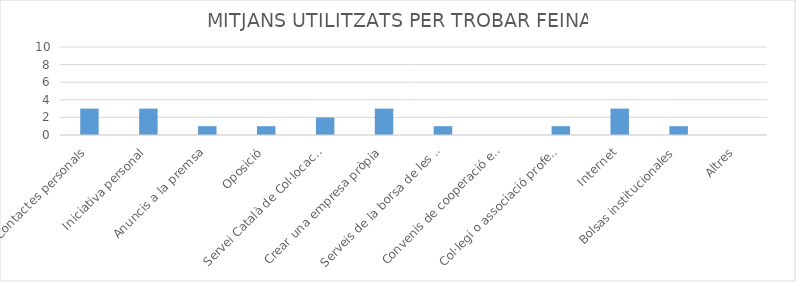
| Category | Series 0 |
|---|---|
| Contactes personals | 3 |
| Iniciativa personal | 3 |
| Anuncis a la premsa | 1 |
| Oposició | 1 |
| Servei Català de Col·locació | 2 |
| Crear una empresa pròpia | 3 |
| Serveis de la borsa de les universitats | 1 |
| Convenis de cooperació educativa | 0 |
| Col·legi o associació professional | 1 |
| Internet | 3 |
| Bolsas institucionales | 1 |
| Altres | 0 |